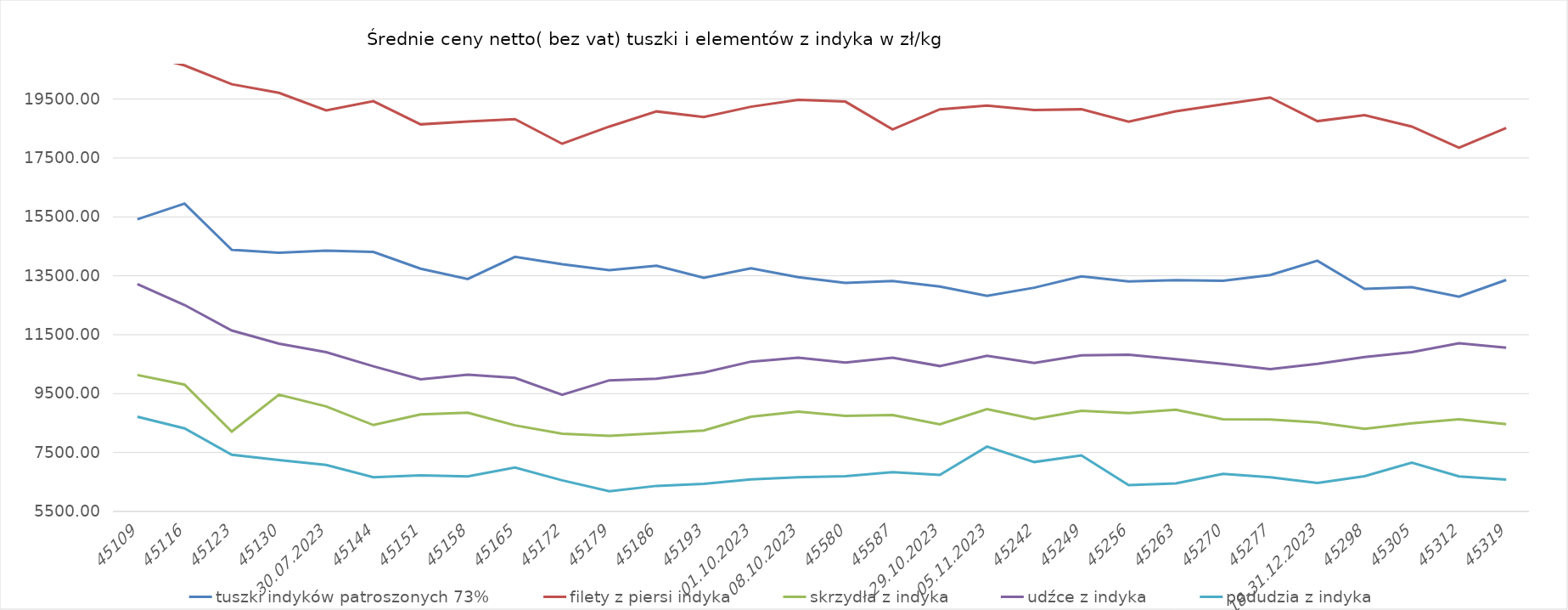
| Category | tuszki indyków patroszonych 73%  | filety z piersi indyka | skrzydła z indyka | udźce z indyka | podudzia z indyka |
|---|---|---|---|---|---|
| 02.07.2023 | 15417.916 | 21052.615 | 10132.453 | 13219.766 | 8714.068 |
| 09.07.2023 | 15952.497 | 20642.458 | 9804.978 | 12507.82 | 8321.308 |
| 16.07.2023 | 14380.614 | 20003.82 | 8212.849 | 11642.43 | 7425.685 |
| 23.07.2023 | 14283.745 | 19710.843 | 9462.007 | 11195.623 | 7246.425 |
| 30.07.2023 | 14352.799 | 19114.889 | 9064.557 | 10909.357 | 7078.978 |
| 06.08.2023 | 14310.091 | 19427.327 | 8433.519 | 10427.258 | 6660.597 |
| 13.08.2023 | 13743.19 | 18641.693 | 8795.811 | 9987.143 | 6724.71 |
| 20.08.2023 | 13391.156 | 18735.912 | 8854.681 | 10140.953 | 6689.766 |
| 27.08.2023 | 14141.702 | 18817.424 | 8424.301 | 10034.996 | 6988.447 |
| 03.09.2023 | 13892.795 | 17982.119 | 8139.613 | 9461.88 | 6555.232 |
| 10.09.2023 | 13694.064 | 18566.766 | 8067.178 | 9950.882 | 6186.669 |
| 17.09.2023 | 13844.285 | 19080.607 | 8155.638 | 10005.61 | 6368.634 |
| 24.09.2023 | 13433.081 | 18890.687 | 8248.172 | 10216.6 | 6439.88 |
| 01.10.2023 | 13756.384 | 19239.784 | 8717.405 | 10586.559 | 6585.874 |
| 08.10.2023 | 13452.604 | 19472.618 | 8891.635 | 10717.252 | 6660.176 |
| 15.10.2024 | 13256.153 | 19413.498 | 8746.729 | 10551.396 | 6698.161 |
| 22.10.2024 | 13324.966 | 18470.302 | 8775.407 | 10716.685 | 6837.251 |
| 29.10.2023 | 13133.831 | 19151.063 | 8460.228 | 10436.368 | 6742.421 |
| 05.11.2023 | 12820.955 | 19279.654 | 8971.328 | 10783.813 | 7701.597 |
| 12.11.2023 | 13095.53 | 19130.879 | 8634.46 | 10542.142 | 7176.96 |
| 19.11.2023 | 13482.102 | 19153.268 | 8918.022 | 10797.027 | 7403.078 |
| 26.11.2023 | 13307.998 | 18734.437 | 8835.702 | 10823.305 | 6392.664 |
| 03.12.2023 | 13354.273 | 19082.562 | 8950.403 | 10668.909 | 6449.263 |
| 10.12.2023 | 13332.863 | 19324.416 | 8627.889 | 10509.84 | 6775.056 |
| 17.12.2023 | 13523.74 | 19555.025 | 8619.594 | 10328.767 | 6662.804 |
| 18-31.12.2023 | 14010.609 | 18750.464 | 8519.606 | 10513.891 | 6466.275 |
| 07.01.2024 | 13059.159 | 18951.328 | 8308.255 | 10739.522 | 6699.148 |
| 14.01.2024 | 13116.353 | 18566.933 | 8491.691 | 10910.417 | 7156.624 |
| 21.01.2024 | 12790.186 | 17849.886 | 8632.768 | 11207.395 | 6691.469 |
| 28.01.2024 | 13358.913 | 18519.059 | 8464.022 | 11059.37 | 6581.539 |